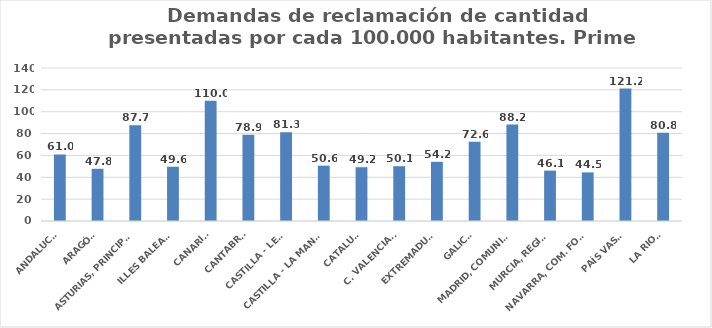
| Category | Series 0 |
|---|---|
| ANDALUCÍA | 60.957 |
| ARAGÓN | 47.761 |
| ASTURIAS, PRINCIPADO | 87.705 |
| ILLES BALEARS | 49.649 |
| CANARIAS | 109.998 |
| CANTABRIA | 78.944 |
| CASTILLA - LEÓN | 81.306 |
| CASTILLA - LA MANCHA | 50.629 |
| CATALUÑA | 49.221 |
| C. VALENCIANA | 50.129 |
| EXTREMADURA | 54.162 |
| GALICIA | 72.588 |
| MADRID, COMUNIDAD | 88.206 |
| MURCIA, REGIÓN | 46.1 |
| NAVARRA, COM. FORAL | 44.454 |
| PAÍS VASCO | 121.24 |
| LA RIOJA | 80.755 |